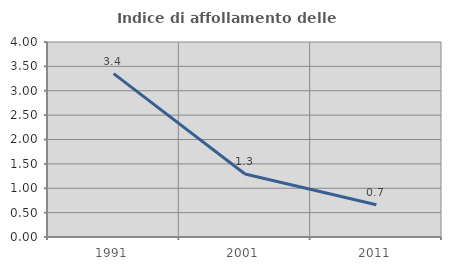
| Category | Indice di affollamento delle abitazioni  |
|---|---|
| 1991.0 | 3.352 |
| 2001.0 | 1.292 |
| 2011.0 | 0.661 |